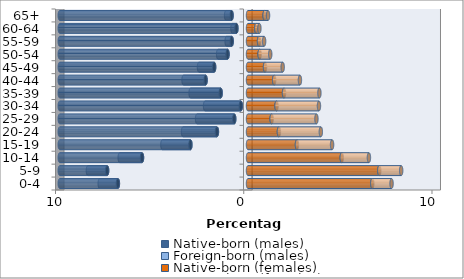
| Category | Native-born (males) | Foreign-born (males) | Native-born (females) | Foreign-born (females) |
|---|---|---|---|---|
| 0-4 | -6.911 | -0.966 | 6.603 | 1.024 |
| 5-9 | -7.484 | -1.022 | 6.974 | 1.163 |
| 10-14 | -5.63 | -1.184 | 4.98 | 1.443 |
| 15-19 | -3.059 | -1.489 | 2.6 | 1.866 |
| 20-24 | -1.65 | -1.801 | 1.642 | 2.227 |
| 25-29 | -0.731 | -1.975 | 1.256 | 2.379 |
| 30-34 | -0.38 | -1.9 | 1.516 | 2.253 |
| 35-39 | -1.452 | -1.598 | 1.914 | 1.879 |
| 40-44 | -2.252 | -1.172 | 1.39 | 1.369 |
| 45-49 | -1.798 | -0.807 | 0.905 | 0.938 |
| 50-54 | -1.087 | -0.5 | 0.617 | 0.564 |
| 55-59 | -0.865 | -0.27 | 0.586 | 0.27 |
| 60-64 | -0.615 | -0.212 | 0.439 | 0.167 |
| 65+ | -0.872 | -0.291 | 0.883 | 0.181 |